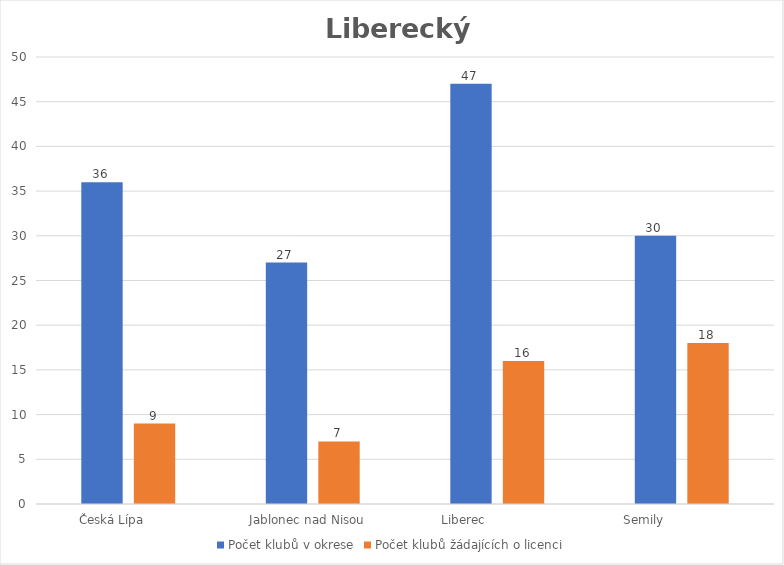
| Category | Počet klubů v okrese | Počet klubů žádajících o licenci |
|---|---|---|
| Česká Lípa         | 36 | 9 |
| Jablonec nad Nisou   | 27 | 7 |
| Liberec                  | 47 | 16 |
| Semily                    | 30 | 18 |